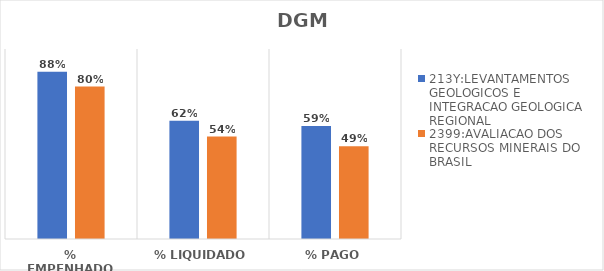
| Category | 213Y:LEVANTAMENTOS GEOLOGICOS E INTEGRACAO GEOLOGICA REGIONAL | 2399:AVALIACAO DOS RECURSOS MINERAIS DO BRASIL |
|---|---|---|
| % EMPENHADO | 0.88 | 0.802 |
| % LIQUIDADO | 0.622 | 0.539 |
| % PAGO | 0.594 | 0.488 |